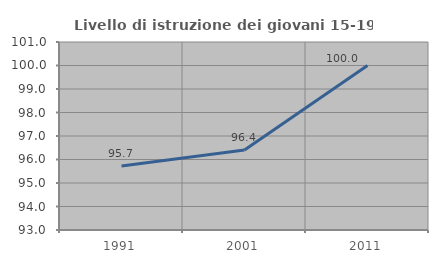
| Category | Livello di istruzione dei giovani 15-19 anni |
|---|---|
| 1991.0 | 95.722 |
| 2001.0 | 96.403 |
| 2011.0 | 100 |